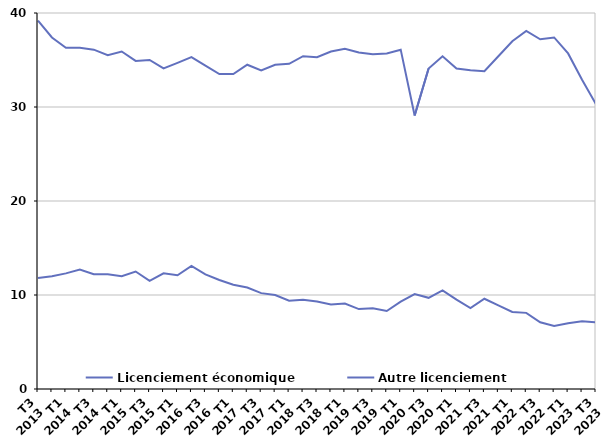
| Category | Licenciement économique | Autre licenciement |
|---|---|---|
| T3
2013 | 11.8 | 39.2 |
| T4
2013 | 12 | 37.4 |
| T1
2014 | 12.3 | 36.3 |
| T2
2014 | 12.7 | 36.3 |
| T3
2014 | 12.2 | 36.1 |
| T4
2014 | 12.2 | 35.5 |
| T1
2015 | 12 | 35.9 |
| T2
2015 | 12.5 | 34.9 |
| T3
2015 | 11.5 | 35 |
| T4
2015 | 12.3 | 34.1 |
| T1
2016 | 12.1 | 34.7 |
| T2
2016 | 13.1 | 35.3 |
| T3
2016 | 12.2 | 34.4 |
| T4
2016 | 11.6 | 33.5 |
| T1
2017 | 11.1 | 33.5 |
| T2
2017 | 10.8 | 34.5 |
| T3
2017 | 10.2 | 33.9 |
| T4
2017 | 10 | 34.5 |
| T1
2018 | 9.4 | 34.6 |
| T2
2018 | 9.5 | 35.4 |
| T3
2018 | 9.3 | 35.3 |
| T4
2018 | 9 | 35.9 |
| T1
2019 | 9.1 | 36.2 |
| T2
2019 | 8.5 | 35.8 |
| T3
2019 | 8.6 | 35.6 |
| T4
2019 | 8.3 | 35.7 |
| T1
2020 | 9.3 | 36.1 |
| T2
2020 | 10.1 | 29.1 |
| T3
2020 | 9.7 | 34.1 |
| T4
2020 | 10.5 | 35.4 |
| T1
2021 | 9.5 | 34.1 |
| T2
2021 | 8.6 | 33.9 |
| T3
2021 | 9.6 | 33.8 |
| T4
2021 | 8.9 | 35.4 |
| T1
2022 | 8.2 | 37 |
| T2
2022 | 8.1 | 38.1 |
| T3
2022 | 7.1 | 37.2 |
| T4
2022 | 6.7 | 37.4 |
| T1
2023 | 7 | 35.7 |
| T2
2023 | 7.2 | 32.9 |
| T3
2023 | 7.1 | 30.3 |